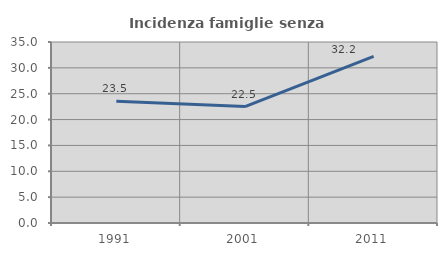
| Category | Incidenza famiglie senza nuclei |
|---|---|
| 1991.0 | 23.544 |
| 2001.0 | 22.517 |
| 2011.0 | 32.223 |